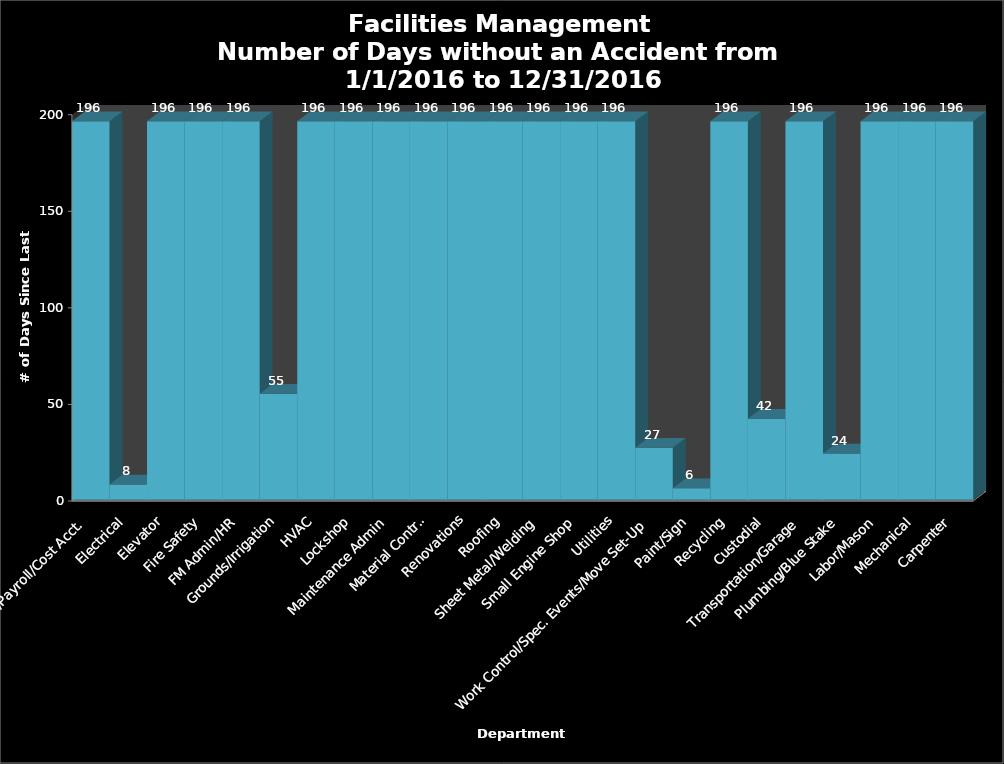
| Category | # of Days |
|---|---|
| Bus Serv/IT/Payroll/Cost Acct. | 196 |
| Electrical | 8 |
| Elevator | 196 |
| Fire Safety | 196 |
| FM Admin/HR | 196 |
| Grounds/Irrigation | 55 |
| HVAC | 196 |
| Lockshop | 196 |
| Maintenance Admin | 196 |
| Material Control | 196 |
| Renovations | 196 |
| Roofing | 196 |
| Sheet Metal/Welding | 196 |
| Small Engine Shop | 196 |
| Utilities | 196 |
| Work Control/Spec. Events/Move Set-Up | 27 |
| Paint/Sign | 6 |
| Recycling | 196 |
| Custodial | 42 |
| Transportation/Garage | 196 |
| Plumbing/Blue Stake | 24 |
| Labor/Mason | 196 |
| Mechanical | 196 |
| Carpenter | 196 |